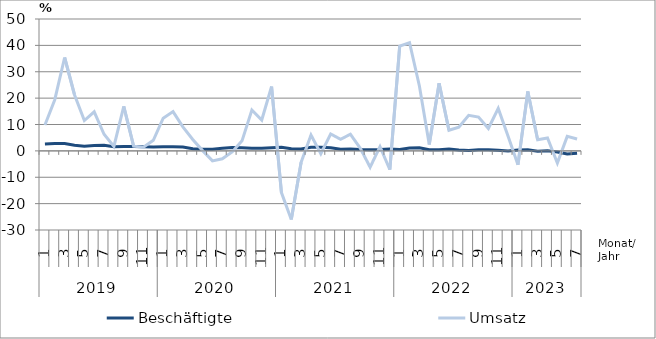
| Category | Beschäftigte | Umsatz |
|---|---|---|
| 0 | 2.6 | 9.8 |
| 1 | 2.8 | 19.4 |
| 2 | 2.8 | 35.4 |
| 3 | 2.1 | 21.3 |
| 4 | 1.8 | 11.5 |
| 5 | 2 | 14.8 |
| 6 | 2.1 | 6.3 |
| 7 | 1.6 | 1.7 |
| 8 | 1.7 | 16.9 |
| 9 | 1.7 | 1.8 |
| 10 | 1.6 | 1.4 |
| 11 | 1.5 | 4 |
| 12 | 1.6 | 12.4 |
| 13 | 1.6 | 14.9 |
| 14 | 1.5 | 9.1 |
| 15 | 0.8 | 4.3 |
| 16 | 0.6 | 0.1 |
| 17 | 0.6 | -3.8 |
| 18 | 1 | -3 |
| 19 | 1.3 | -0.4 |
| 20 | 1.2 | 3.8 |
| 21 | 1 | 15.5 |
| 22 | 1 | 11.7 |
| 23 | 1.2 | 24.4 |
| 24 | 1.4 | -15.8 |
| 25 | 0.8 | -26 |
| 26 | 0.7 | -4.3 |
| 27 | 1.4 | 6 |
| 28 | 1.4 | -1.1 |
| 29 | 1.2 | 6.4 |
| 30 | 0.6 | 4.4 |
| 31 | 0.7 | 6.3 |
| 32 | 0.5 | 1 |
| 33 | 0.4 | -6.2 |
| 34 | 0.5 | 1.6 |
| 35 | 0.7 | -7.1 |
| 36 | 0.5 | 39.7 |
| 37 | 1.1 | 41 |
| 38 | 1.2 | 24.6 |
| 39 | 0.4 | 2.4 |
| 40 | 0.4 | 25.6 |
| 41 | 0.7 | 7.8 |
| 42 | 0.3 | 9 |
| 43 | 0.1 | 13.5 |
| 44 | 0.4 | 12.8 |
| 45 | 0.4 | 8.5 |
| 46 | 0.2 | 16.1 |
| 47 | 0 | 5.5 |
| 48 | 0.3 | -5.3 |
| 49 | 0.4 | 22.5 |
| 50 | -0.1 | 4.2 |
| 51 | 0 | 4.9 |
| 52 | -0.4 | -4.6 |
| 53 | -1.2 | 5.5 |
| 54 | -0.9 | 4.5 |